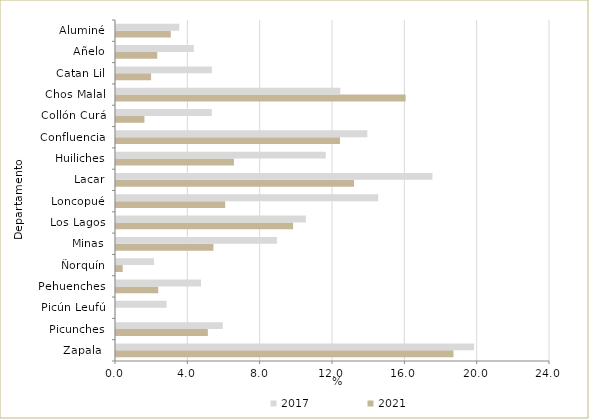
| Category | 2021 | 2017 |
|---|---|---|
| Zapala  | 18.662 | 19.8 |
| Picunches | 5.079 | 5.9 |
| Picún Leufú | 0 | 2.8 |
| Pehuenches | 2.335 | 4.7 |
| Ñorquín | 0.37 | 2.1 |
| Minas | 5.388 | 8.9 |
| Los Lagos | 9.793 | 10.5 |
| Loncopué | 6.038 | 14.5 |
| Lacar | 13.163 | 17.5 |
| Huiliches | 6.522 | 11.6 |
| Confluencia | 12.388 | 13.9 |
| Collón Curá | 1.571 | 5.3 |
| Chos Malal | 16.018 | 12.4 |
| Catan Lil | 1.942 | 5.3 |
| Añelo | 2.28 | 4.3 |
| Aluminé | 3.03 | 3.5 |